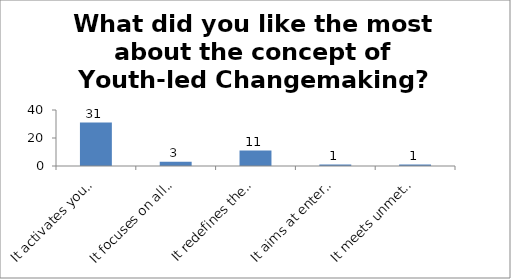
| Category | What did you like the most about the concept of Youth-led Changemaking? |
|---|---|
| It activates young people as changemakers | 31 |
| It focuses on all (troubled and prepared) young people | 3 |
| It redefines the field of youth development | 11 |
| It aims at enterprising education | 1 |
| It meets unmet service needs of the society | 1 |